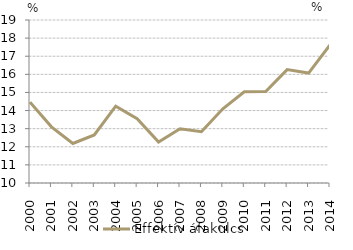
| Category | Effektív áfakulcs |
|---|---|
| 2000.0 | 14.46 |
| 2001.0 | 13.1 |
| 2002.0 | 12.18 |
| 2003.0 | 12.651 |
| 2004.0 | 14.242 |
| 2005.0 | 13.553 |
| 2006.0 | 12.26 |
| 2007.0 | 12.993 |
| 2008.0 | 12.831 |
| 2009.0 | 14.099 |
| 2010.0 | 15.038 |
| 2011.0 | 15.046 |
| 2012.0 | 16.26 |
| 2013.0 | 16.07 |
| 2014.0 | 17.626 |